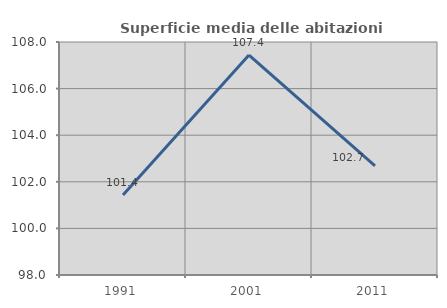
| Category | Superficie media delle abitazioni occupate |
|---|---|
| 1991.0 | 101.435 |
| 2001.0 | 107.441 |
| 2011.0 | 102.682 |